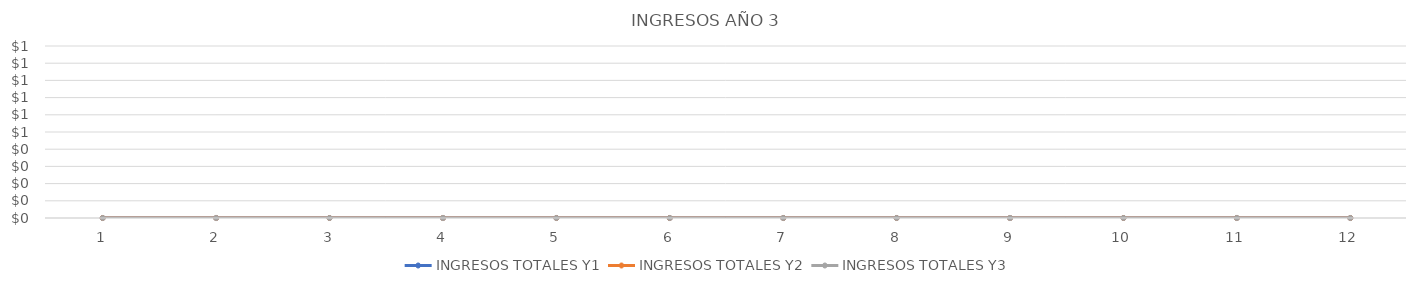
| Category | INGRESOS TOTALES Y1 | INGRESOS TOTALES Y2 | INGRESOS TOTALES Y3 |
|---|---|---|---|
| 0 | 0 | 0 | 0 |
| 1 | 0 | 0 | 0 |
| 2 | 0 | 0 | 0 |
| 3 | 0 | 0 | 0 |
| 4 | 0 | 0 | 0 |
| 5 | 0 | 0 | 0 |
| 6 | 0 | 0 | 0 |
| 7 | 0 | 0 | 0 |
| 8 | 0 | 0 | 0 |
| 9 | 0 | 0 | 0 |
| 10 | 0 | 0 | 0 |
| 11 | 0 | 0 | 0 |